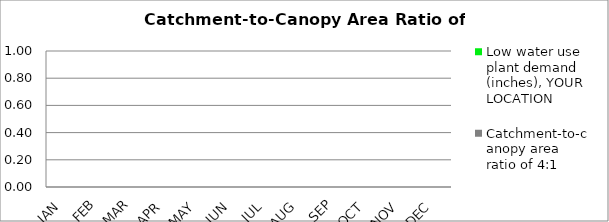
| Category | Low water use plant demand (inches), YOUR LOCATION | Catchment-to-canopy area ratio of 4:1  |
|---|---|---|
| JAN | 0 | 0 |
| FEB | 0 | 0 |
| MAR | 0 | 0 |
| APR | 0 | 0 |
| MAY | 0 | 0 |
| JUN | 0 | 0 |
| JUL | 0 | 0 |
| AUG | 0 | 0 |
| SEP | 0 | 0 |
| OCT | 0 | 0 |
| NOV | 0 | 0 |
| DEC | 0 | 0 |